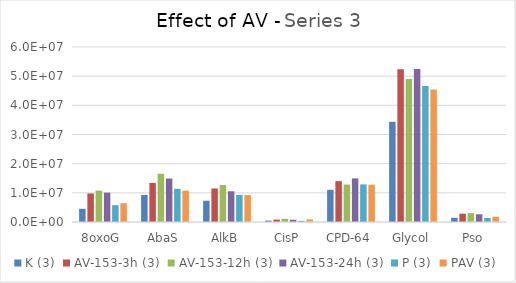
| Category | K (3) | AV-153-3h (3) | AV-153-12h (3) | AV-153-24h (3) | P (3) | PAV (3) |
|---|---|---|---|---|---|---|
| 8oxoG | 4527905.5 | 9783622.5 | 10775724.5 | 10073992 | 5776445.5 | 6445027.5 |
| AbaS | 9277951 | 13406051 | 16534902.5 | 14895549.5 | 11374998 | 10752818 |
| AlkB | 7290620 | 11496891.5 | 12669486 | 10538534.5 | 9295858 | 9217763 |
| CisP | 467951.5 | 825713.5 | 1101642 | 772971.5 | 399580 | 895154.5 |
| CPD-64 | 11023284.5 | 14005808.5 | 12846821 | 14953417.5 | 12895292 | 12776114.5 |
| Glycol | 34348372 | 52394414 | 49023720 | 52484139.5 | 46605689.5 | 45460924.5 |
| Pso | 1446554.5 | 2863469.5 | 3051016 | 2655937.5 | 1372861 | 1787096.5 |